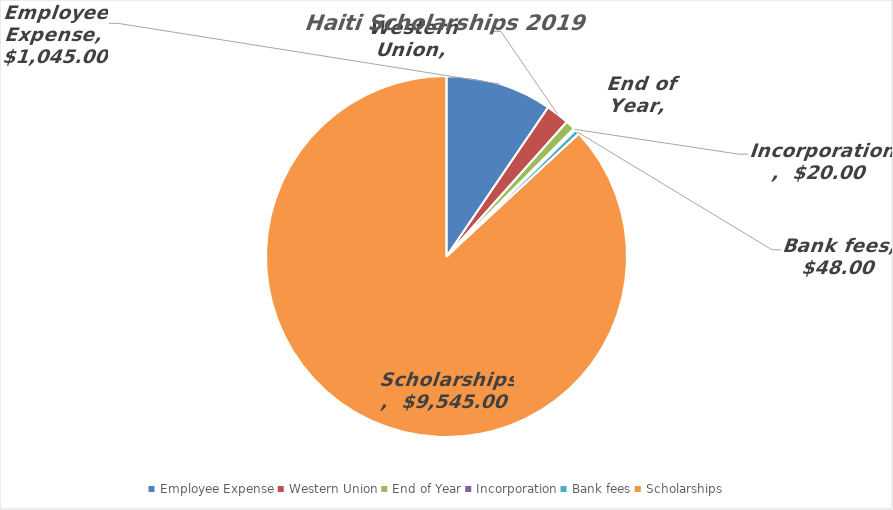
| Category | Series 0 |
|---|---|
| Employee Expense | 1045 |
| Western Union | 229 |
| End of Year | 95 |
| Incorporation | 20 |
| Bank fees | 48 |
| Scholarships | 9545 |